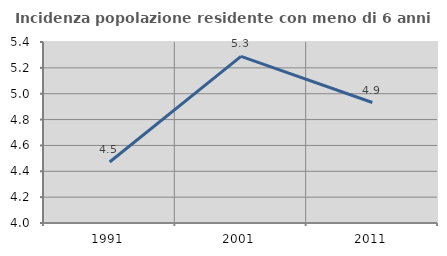
| Category | Incidenza popolazione residente con meno di 6 anni |
|---|---|
| 1991.0 | 4.472 |
| 2001.0 | 5.289 |
| 2011.0 | 4.932 |